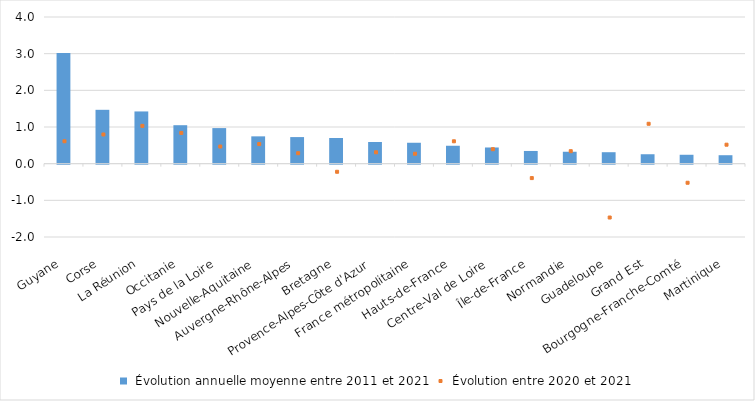
| Category |  Évolution annuelle moyenne entre 2011 et 2021 |
|---|---|
| Guyane | 3.016 |
| Corse | 1.469 |
| La Réunion | 1.424 |
| Occitanie | 1.049 |
| Pays de la Loire | 0.97 |
| Nouvelle-Aquitaine | 0.745 |
| Auvergne-Rhône-Alpes | 0.725 |
| Bretagne | 0.701 |
| Provence-Alpes-Côte d'Azur | 0.591 |
| France métropolitaine | 0.57 |
| Hauts-de-France | 0.489 |
| Centre-Val de Loire | 0.441 |
| Île-de-France | 0.346 |
| Normandie | 0.325 |
| Guadeloupe | 0.313 |
| Grand Est | 0.257 |
| Bourgogne-Franche-Comté | 0.243 |
| Martinique | 0.231 |